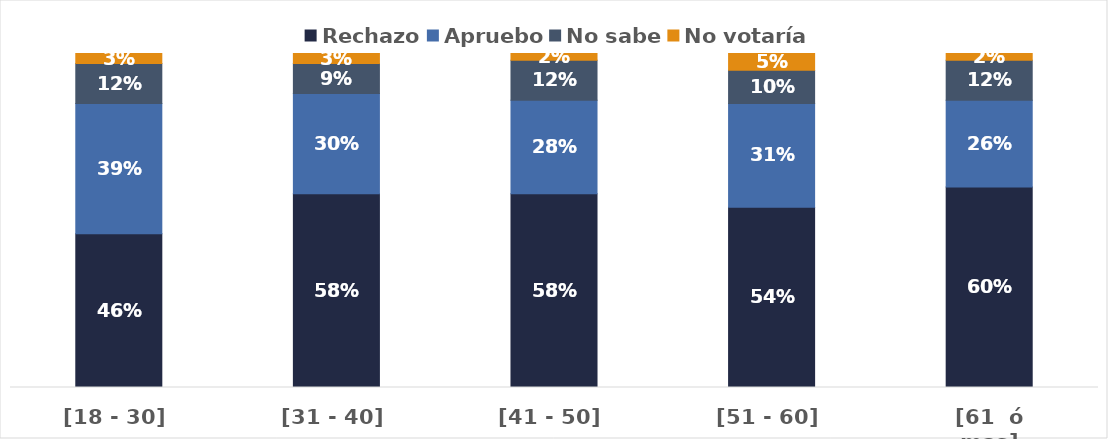
| Category | Rechazo | Apruebo | No sabe | No votaría |
|---|---|---|---|---|
| [18 - 30] | 0.46 | 0.39 | 0.12 | 0.03 |
| [31 - 40] | 0.58 | 0.3 | 0.09 | 0.03 |
| [41 - 50] | 0.58 | 0.28 | 0.12 | 0.02 |
| [51 - 60] | 0.54 | 0.31 | 0.1 | 0.05 |
| [61  ó mas] | 0.6 | 0.26 | 0.12 | 0.02 |